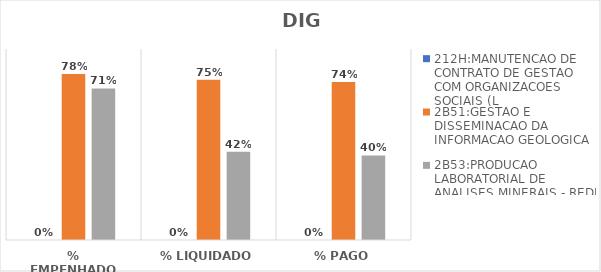
| Category | 212H:MANUTENCAO DE CONTRATO DE GESTAO COM ORGANIZACOES SOCIAIS (L | 2B51:GESTAO E DISSEMINACAO DA INFORMACAO GEOLOGICA | 2B53:PRODUCAO LABORATORIAL DE ANALISES MINERAIS - REDE LAMIN |
|---|---|---|---|
| % EMPENHADO | 0 | 0.782 | 0.714 |
| % LIQUIDADO | 0 | 0.755 | 0.416 |
| % PAGO | 0 | 0.744 | 0.399 |